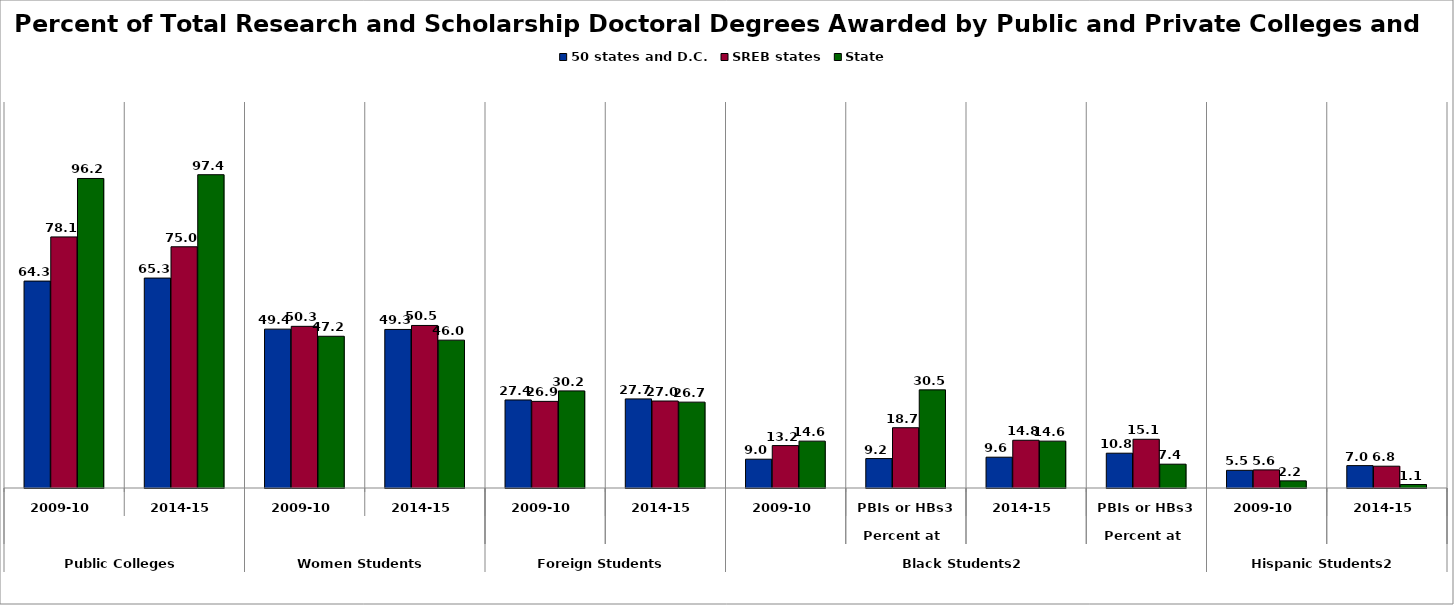
| Category | 50 states and D.C. | SREB states | State |
|---|---|---|---|
| 0 | 64.327 | 78.051 | 96.226 |
| 1 | 65.263 | 74.993 | 97.396 |
| 2 | 49.391 | 50.259 | 47.17 |
| 3 | 49.29 | 50.532 | 45.964 |
| 4 | 27.372 | 26.934 | 30.189 |
| 5 | 27.696 | 27.045 | 26.693 |
| 6 | 8.953 | 13.186 | 14.568 |
| 7 | 9.15 | 18.739 | 30.508 |
| 8 | 9.575 | 14.84 | 14.568 |
| 9 | 10.82 | 15.149 | 7.407 |
| 10 | 5.495 | 5.628 | 2.222 |
| 11 | 6.958 | 6.777 | 1.079 |